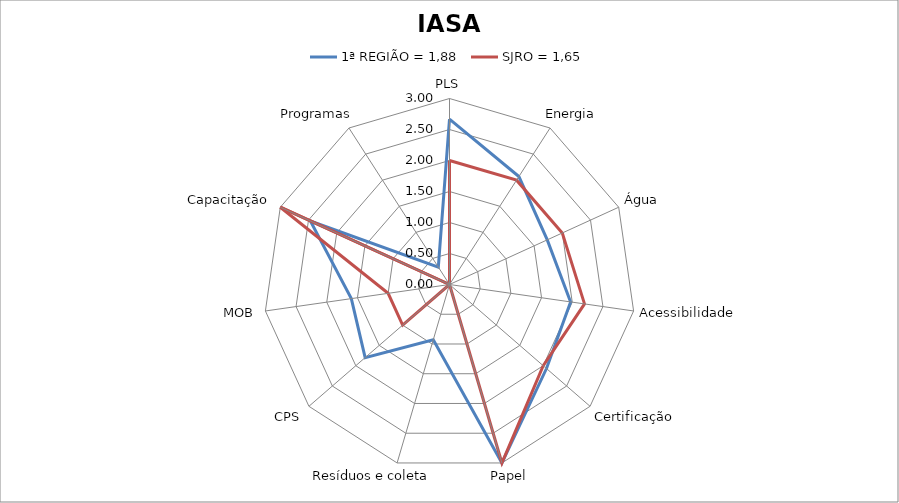
| Category | 1ª REGIÃO = 1,88 | SJRO = 1,65 |
|---|---|---|
| PLS | 2.667 | 2 |
| Energia | 2.07 | 2 |
| Água | 1.733 | 2 |
| Acessibilidade | 1.973 | 2.2 |
| Certificação | 2.07 | 2 |
| Papel | 3 | 3 |
| Resíduos e coleta | 0.93 | 0 |
| CPS | 1.8 | 1 |
| MOB | 1.6 | 1 |
| Capacitação | 2.467 | 3 |
| Programas | 0.333 | 0 |